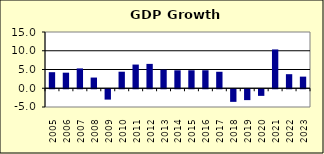
| Category | 2.5 |
|---|---|
| 2005.0 | 4.282 |
| 2006.0 | 4.152 |
| 2007.0 | 5.288 |
| 2008.0 | 2.852 |
| 2009.0 | -2.759 |
| 2010.0 | 4.41 |
| 2011.0 | 6.317 |
| 2012.0 | 6.496 |
| 2013.0 | 4.927 |
| 2014.0 | 4.785 |
| 2015.0 | 4.792 |
| 2016.0 | 4.798 |
| 2017.0 | 4.396 |
| 2018.0 | -3.363 |
| 2019.0 | -2.897 |
| 2020.0 | -1.766 |
| 2021.0 | 10.347 |
| 2022.0 | 3.751 |
| 2023.0 | 3.1 |